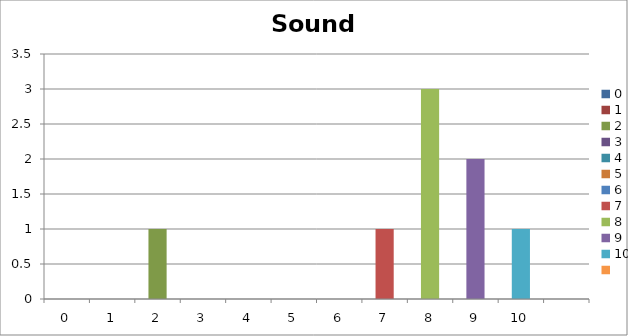
| Category | Sound Around |
|---|---|
| 0.0 | 0 |
| 1.0 | 0 |
| 2.0 | 1 |
| 3.0 | 0 |
| 4.0 | 0 |
| 5.0 | 0 |
| 6.0 | 0 |
| 7.0 | 1 |
| 8.0 | 3 |
| 9.0 | 2 |
| 10.0 | 1 |